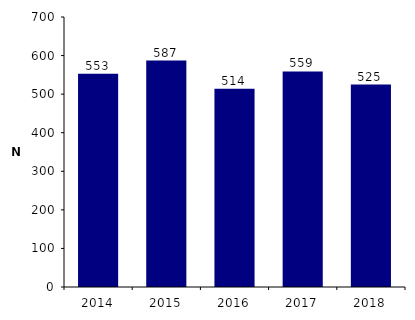
| Category | Nombre de détermination |
|---|---|
| 2014.0 | 553 |
| 2015.0 | 587 |
| 2016.0 | 514 |
| 2017.0 | 559 |
| 2018.0 | 525 |